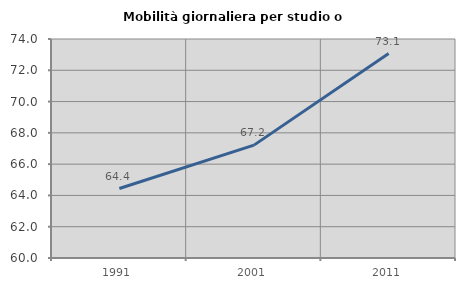
| Category | Mobilità giornaliera per studio o lavoro |
|---|---|
| 1991.0 | 64.44 |
| 2001.0 | 67.215 |
| 2011.0 | 73.068 |